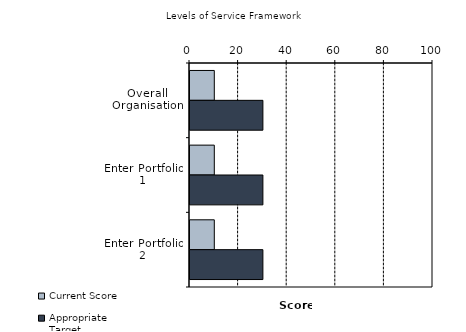
| Category | Current Score | Appropriate Target |
|---|---|---|
| Overall Organisation | 10 | 30 |
| Enter Portfolio 1 | 10 | 30 |
| Enter Portfolio 2 | 10 | 30 |